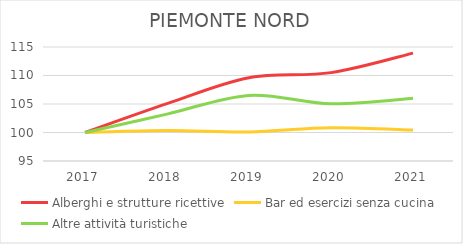
| Category | Alberghi e strutture ricettive | Bar ed esercizi senza cucina | Altre attività turistiche |
|---|---|---|---|
| 2017.0 | 100 | 100 | 100 |
| 2018.0 | 105.063 | 100.334 | 103.224 |
| 2019.0 | 109.62 | 100.095 | 106.512 |
| 2020.0 | 110.506 | 100.843 | 105.029 |
| 2021.0 | 113.924 | 100.43 | 105.996 |